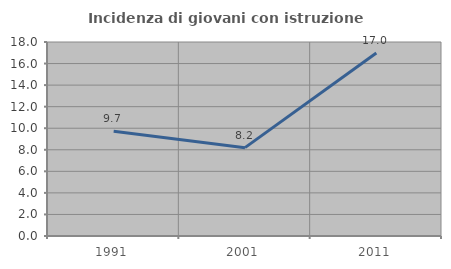
| Category | Incidenza di giovani con istruzione universitaria |
|---|---|
| 1991.0 | 9.722 |
| 2001.0 | 8.197 |
| 2011.0 | 16.986 |